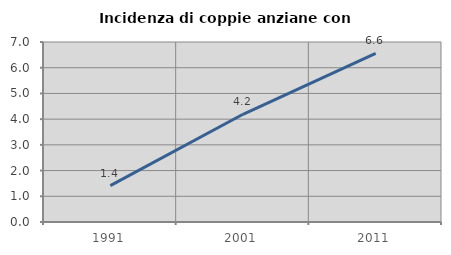
| Category | Incidenza di coppie anziane con figli |
|---|---|
| 1991.0 | 1.417 |
| 2001.0 | 4.188 |
| 2011.0 | 6.557 |